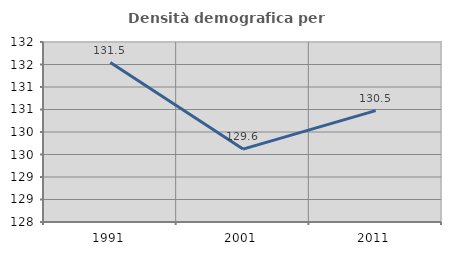
| Category | Densità demografica |
|---|---|
| 1991.0 | 131.543 |
| 2001.0 | 129.62 |
| 2011.0 | 130.475 |